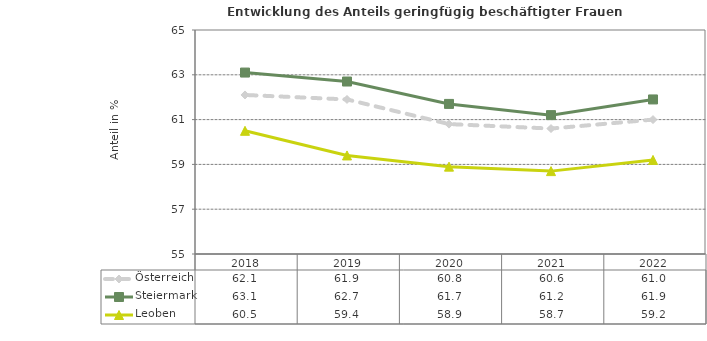
| Category | Österreich | Steiermark | Leoben |
|---|---|---|---|
| 2022.0 | 61 | 61.9 | 59.2 |
| 2021.0 | 60.6 | 61.2 | 58.7 |
| 2020.0 | 60.8 | 61.7 | 58.9 |
| 2019.0 | 61.9 | 62.7 | 59.4 |
| 2018.0 | 62.1 | 63.1 | 60.5 |